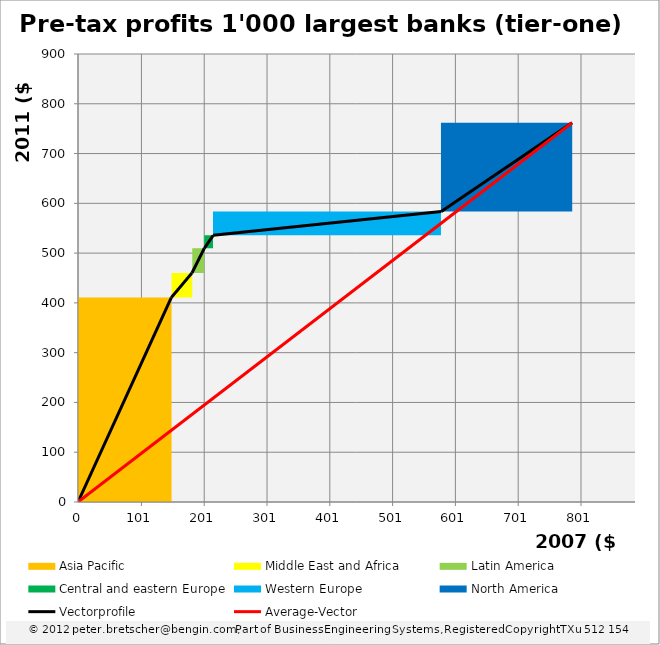
| Category | transparent | Asia Pacific | Middle East and Africa | Latin America | Central and eastern Europe | Western Europe | North America | Border right & top |
|---|---|---|---|---|---|---|---|---|
| 0.0 | 0 | 410.718 | 0 | 0 | 0 | 0 | 0 | 0 |
| 148.554 | 0 | 410.718 | 0 | 0 | 0 | 0 | 0 | 0 |
| 148.554 | 410.718 | 0 | 49.53 | 0 | 0 | 0 | 0 | 0 |
| 181.566 | 410.718 | 0 | 49.53 | 0 | 0 | 0 | 0 | 0 |
| 181.566 | 460.248 | 0 | 0 | 49.53 | 0 | 0 | 0 | 0 |
| 201.216 | 460.248 | 0 | 0 | 49.53 | 0 | 0 | 0 | 0 |
| 201.216 | 509.778 | 0 | 0 | 0 | 25.908 | 0 | 0 | 0 |
| 215.364 | 509.778 | 0 | 0 | 0 | 25.908 | 0 | 0 | 0 |
| 215.364 | 535.686 | 0 | 0 | 0 | 0 | 48.006 | 0 | 0 |
| 578.496 | 535.686 | 0 | 0 | 0 | 0 | 48.006 | 0 | 0 |
| 578.496 | 583.692 | 0 | 0 | 0 | 0 | 0 | 178.308 | 0 |
| 786.7860000000001 | 583.692 | 0 | 0 | 0 | 0 | 0 | 178.308 | 0 |
| 786.7860000000001 | 762 | 0 | 0 | 0 | 0 | 0 | 0 | 0 |
| 786.7860000000001 | 762 | 0 | 0 | 0 | 0 | 0 | 0 | 0 |
| 786.7860000000001 | 762 | 0 | 0 | 0 | 0 | 0 | 0 | 0 |
| 786.7860000000001 | 762 | 0 | 0 | 0 | 0 | 0 | 0 | 0 |
| 786.7860000000001 | 762 | 0 | 0 | 0 | 0 | 0 | 0 | 0 |
| 786.7860000000001 | 762 | 0 | 0 | 0 | 0 | 0 | 0 | 0 |
| 786.7860000000001 | 762 | 0 | 0 | 0 | 0 | 0 | 0 | 0 |
| 786.7860000000001 | 762 | 0 | 0 | 0 | 0 | 0 | 0 | 0 |
| 786.7860000000001 | 762 | 0 | 0 | 0 | 0 | 0 | 0 | 0 |
| 886.7860000000001 | 762 | 0 | 0 | 0 | 0 | 0 | 0 | 0 |
| 886.7860000000001 | 762 | 0 | 0 | 0 | 0 | 0 | 0 | 0 |